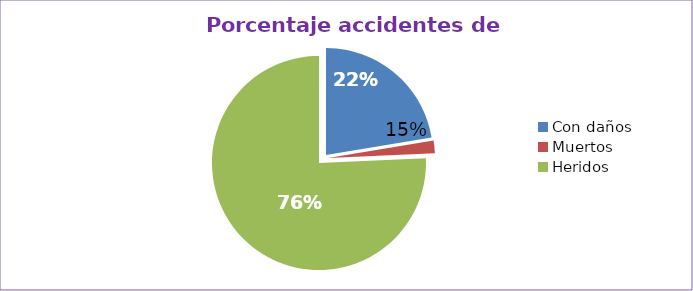
| Category | Series 0 |
|---|---|
| Con daños  | 22.397 |
| Muertos  | 1.893 |
| Heridos  | 75.71 |